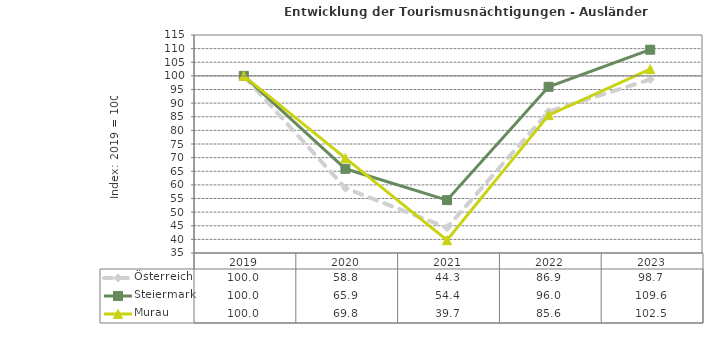
| Category | Österreich | Steiermark | Murau |
|---|---|---|---|
| 2023.0 | 98.7 | 109.6 | 102.5 |
| 2022.0 | 86.9 | 96 | 85.6 |
| 2021.0 | 44.3 | 54.4 | 39.7 |
| 2020.0 | 58.8 | 65.9 | 69.8 |
| 2019.0 | 100 | 100 | 100 |